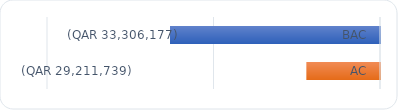
| Category | CPI-SPI |
|---|---|
| BAC | -33306177 |
| AC | -29211739.128 |